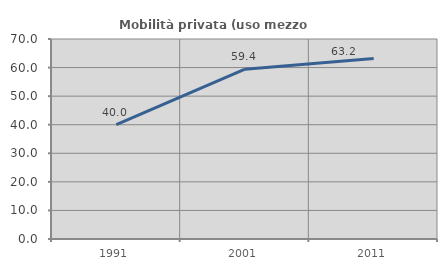
| Category | Mobilità privata (uso mezzo privato) |
|---|---|
| 1991.0 | 40 |
| 2001.0 | 59.443 |
| 2011.0 | 63.158 |